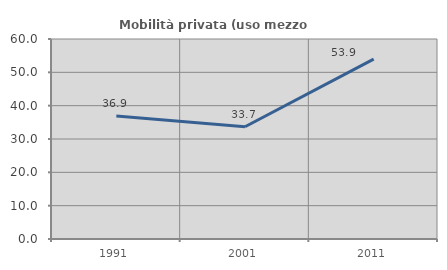
| Category | Mobilità privata (uso mezzo privato) |
|---|---|
| 1991.0 | 36.893 |
| 2001.0 | 33.684 |
| 2011.0 | 53.947 |